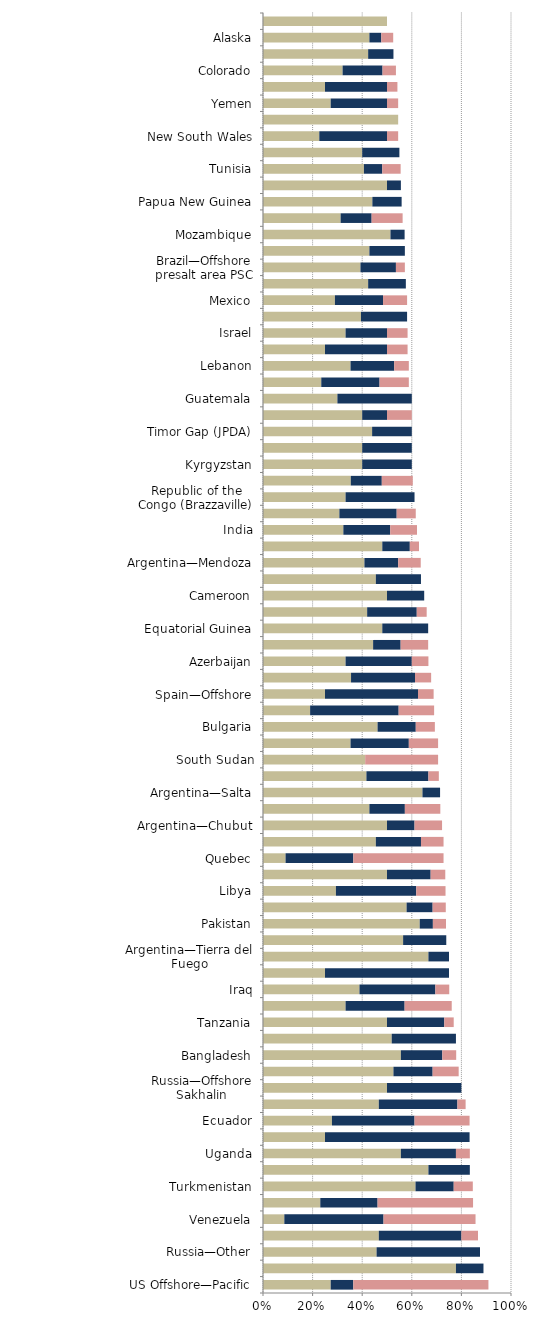
| Category |   Mild deterrent to investment |   Strong deterrent to investment |   Would not pursue investment due to this factor |
|---|---|---|---|
| US Offshore—Pacific | 0.273 | 0.091 | 0.545 |
| Ethiopia | 0.778 | 0.111 | 0 |
| Russia—Other | 0.458 | 0.417 | 0 |
| Russia—Eastern Siberia | 0.467 | 0.333 | 0.067 |
| Venezuela | 0.086 | 0.4 | 0.371 |
| Iran | 0.231 | 0.231 | 0.385 |
| Turkmenistan | 0.615 | 0.154 | 0.077 |
| Uzbekistan | 0.667 | 0.167 | 0 |
| Uganda | 0.556 | 0.222 | 0.056 |
| Russia—Offshore Arctic | 0.25 | 0.583 | 0 |
| Ecuador | 0.278 | 0.333 | 0.222 |
| Indonesia | 0.467 | 0.317 | 0.033 |
| Russia—Offshore Sakhalin | 0.5 | 0.3 | 0 |
| Argentina—Santa Cruz | 0.526 | 0.158 | 0.105 |
| Bangladesh | 0.556 | 0.167 | 0.056 |
| Kazakhstan | 0.519 | 0.259 | 0 |
| Tanzania | 0.5 | 0.231 | 0.038 |
| Italy | 0.333 | 0.238 | 0.19 |
| Iraq | 0.389 | 0.306 | 0.056 |
| Spain—Onshore | 0.25 | 0.5 | 0 |
| Argentina—Tierra del Fuego | 0.667 | 0.083 | 0 |
| Cambodia | 0.565 | 0.174 | 0 |
| Pakistan | 0.632 | 0.053 | 0.053 |
| Madagascar | 0.579 | 0.105 | 0.053 |
| Libya | 0.294 | 0.324 | 0.118 |
| Egypt | 0.5 | 0.176 | 0.059 |
| Quebec | 0.091 | 0.273 | 0.364 |
| Albania | 0.455 | 0.182 | 0.091 |
| Argentina—Chubut | 0.5 | 0.111 | 0.111 |
| Ukraine | 0.429 | 0.143 | 0.143 |
| Argentina—Salta | 0.643 | 0.071 | 0 |
| Algeria | 0.417 | 0.25 | 0.042 |
| South Sudan | 0.412 | 0 | 0.294 |
| Bolivia | 0.353 | 0.235 | 0.118 |
| Bulgaria | 0.462 | 0.154 | 0.077 |
| California | 0.19 | 0.357 | 0.143 |
| Spain—Offshore | 0.25 | 0.375 | 0.063 |
| China | 0.355 | 0.258 | 0.065 |
| Azerbaijan | 0.333 | 0.267 | 0.067 |
| Democratic Republic of the Congo (Kinshasa) | 0.444 | 0.111 | 0.111 |
| Equatorial Guinea | 0.481 | 0.185 | 0 |
| Myanmar | 0.42 | 0.2 | 0.04 |
| Cameroon | 0.5 | 0.15 | 0 |
| Niger | 0.455 | 0.182 | 0 |
| Argentina—Mendoza | 0.409 | 0.136 | 0.091 |
| Argentina—Neuquen | 0.481 | 0.111 | 0.037 |
| India | 0.324 | 0.189 | 0.108 |
| Kuwait | 0.308 | 0.231 | 0.077 |
| Republic of the Congo (Brazzaville) | 0.333 | 0.278 | 0 |
| Nigeria | 0.354 | 0.125 | 0.125 |
| Kyrgyzstan | 0.4 | 0.2 | 0 |
| Mali | 0.4 | 0.2 | 0 |
| Timor Gap (JPDA) | 0.44 | 0.16 | 0 |
| Somaliland | 0.4 | 0.1 | 0.1 |
| Guatemala | 0.3 | 0.3 | 0 |
| New York | 0.235 | 0.235 | 0.118 |
| Lebanon | 0.353 | 0.176 | 0.059 |
| France | 0.25 | 0.25 | 0.083 |
| Israel | 0.333 | 0.167 | 0.083 |
| Gabon | 0.395 | 0.186 | 0 |
| Mexico | 0.29 | 0.194 | 0.097 |
| Angola | 0.424 | 0.152 | 0 |
| Brazil—Offshore presalt area PSC | 0.393 | 0.143 | 0.036 |
| Greenland | 0.429 | 0.143 | 0 |
| Mozambique | 0.514 | 0.057 | 0 |
| US Offshore—Alaska | 0.313 | 0.125 | 0.125 |
| Papua New Guinea | 0.441 | 0.118 | 0 |
| Nova Scotia | 0.5 | 0.056 | 0 |
| Tunisia | 0.407 | 0.074 | 0.074 |
| Chad | 0.4 | 0.15 | 0 |
| New South Wales | 0.227 | 0.273 | 0.045 |
| Hungary | 0.545 | 0 | 0 |
| Yemen | 0.273 | 0.227 | 0.045 |
| South Africa | 0.25 | 0.25 | 0.042 |
| Colorado | 0.321 | 0.161 | 0.054 |
| Vietnam | 0.424 | 0.102 | 0 |
| Alaska | 0.429 | 0.048 | 0.048 |
| Northwest Territories | 0.5 | 0 | 0 |